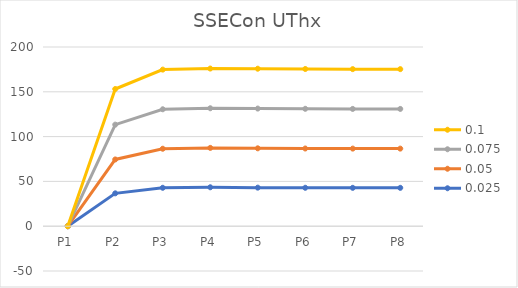
| Category | 0.025 | 0.05 | 0.075 | 0.1 |
|---|---|---|---|---|
| 0 | 0 | 0 | 0 | 0 |
| 1 | 36.671 | 37.821 | 38.862 | 39.773 |
| 2 | 42.875 | 43.578 | 44.046 | 44.271 |
| 3 | 43.444 | 43.948 | 44.24 | 44.319 |
| 4 | 43.025 | 43.895 | 44.369 | 44.48 |
| 5 | 42.895 | 43.822 | 44.313 | 44.424 |
| 6 | 42.821 | 43.783 | 44.29 | 44.411 |
| 7 | 42.814 | 43.783 | 44.291 | 44.411 |